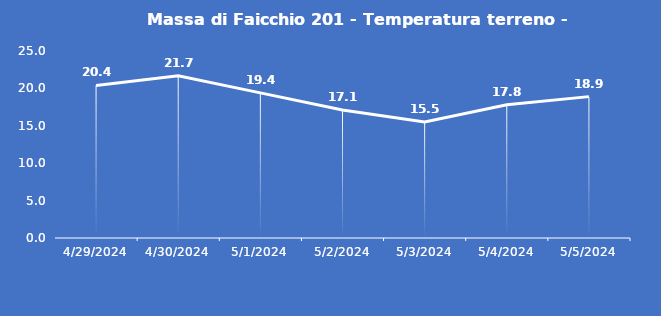
| Category | Massa di Faicchio 201 - Temperatura terreno - Grezzo (°C) |
|---|---|
| 4/29/24 | 20.4 |
| 4/30/24 | 21.7 |
| 5/1/24 | 19.4 |
| 5/2/24 | 17.1 |
| 5/3/24 | 15.5 |
| 5/4/24 | 17.8 |
| 5/5/24 | 18.9 |